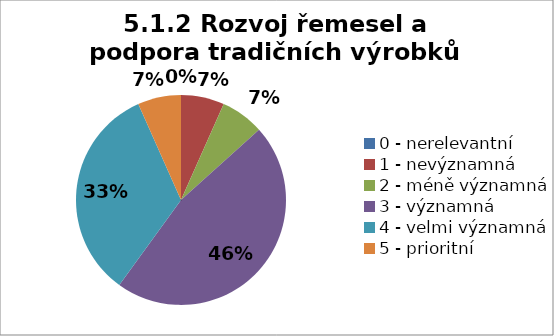
| Category | Series 5 | Series 4 | Series 3 | Series 2 | Series 1 | Series 0 |
|---|---|---|---|---|---|---|
| 0 - nerelevantní | 0 | 6.667 | 0 | 0 | 0 | 0 |
| 1 - nevýznamná | 6.667 | 0 | 0 | 6.667 | 0 | 0 |
| 2 - méně významná | 6.667 | 6.667 | 26.667 | 0 | 6.667 | 0 |
| 3 - významná | 46.667 | 40 | 46.667 | 53.333 | 46.667 | 33.333 |
| 4 - velmi významná | 33.333 | 26.667 | 13.333 | 40 | 33.333 | 40 |
| 5 - prioritní | 6.667 | 20 | 13.333 | 0 | 13.333 | 26.667 |